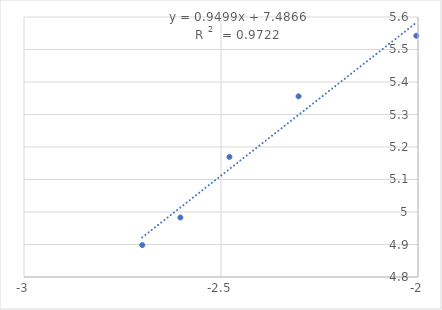
| Category | Series 0 |
|---|---|
| -2.0043213737826426 | 5.542 |
| -2.303196057420489 | 5.356 |
| -2.4785664955938436 | 5.169 |
| -2.603144372620182 | 4.983 |
| -2.699837725867246 | 4.898 |